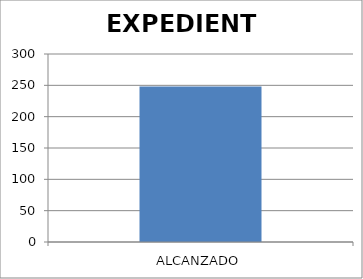
| Category | EXPEDIENTE |
|---|---|
| ALCANZADO | 248 |